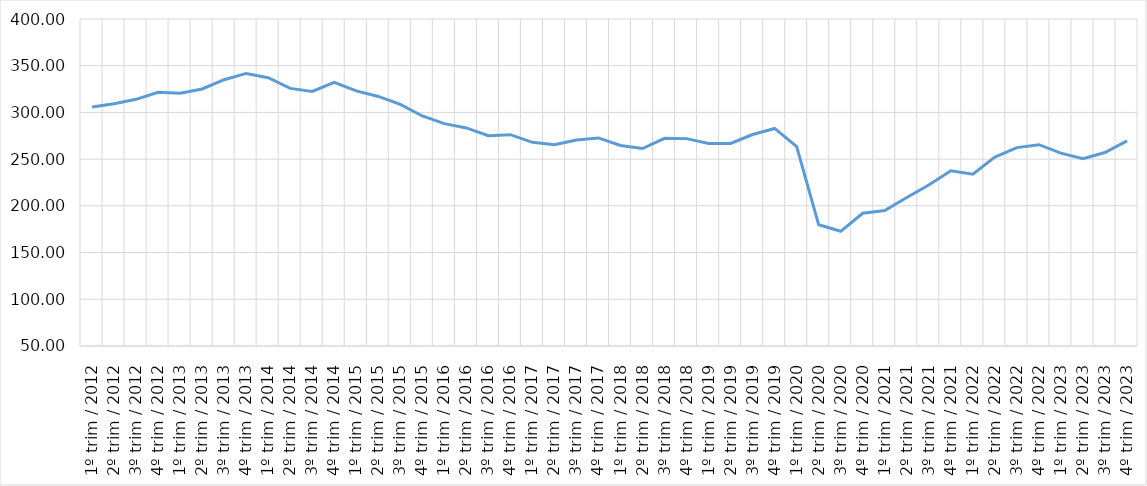
| Category | 40% mais pobres |
|---|---|
| 1º trim / 2012 | 305.834 |
| 2º trim / 2012 | 309.27 |
| 3º trim / 2012 | 314.035 |
| 4º trim / 2012 | 321.61 |
| 1º trim / 2013 | 320.483 |
| 2º trim / 2013 | 325.075 |
| 3º trim / 2013 | 334.989 |
| 4º trim / 2013 | 341.747 |
| 1º trim / 2014 | 337.115 |
| 2º trim / 2014 | 325.75 |
| 3º trim / 2014 | 322.489 |
| 4º trim / 2014 | 332.254 |
| 1º trim / 2015 | 323.009 |
| 2º trim / 2015 | 317.098 |
| 3º trim / 2015 | 308.635 |
| 4º trim / 2015 | 296.185 |
| 1º trim / 2016 | 288.044 |
| 2º trim / 2016 | 283.432 |
| 3º trim / 2016 | 275.116 |
| 4º trim / 2016 | 276.181 |
| 1º trim / 2017 | 268.001 |
| 2º trim / 2017 | 265.444 |
| 3º trim / 2017 | 270.522 |
| 4º trim / 2017 | 272.713 |
| 1º trim / 2018 | 264.583 |
| 2º trim / 2018 | 261.371 |
| 3º trim / 2018 | 272.252 |
| 4º trim / 2018 | 271.962 |
| 1º trim / 2019 | 266.667 |
| 2º trim / 2019 | 266.828 |
| 3º trim / 2019 | 276.358 |
| 4º trim / 2019 | 282.85 |
| 1º trim / 2020 | 263.529 |
| 2º trim / 2020 | 179.72 |
| 3º trim / 2020 | 172.766 |
| 4º trim / 2020 | 192.065 |
| 1º trim / 2021 | 194.922 |
| 2º trim / 2021 | 208.864 |
| 3º trim / 2021 | 222.355 |
| 4º trim / 2021 | 237.538 |
| 1º trim / 2022 | 233.929 |
| 2º trim / 2022 | 252.271 |
| 3º trim / 2022 | 262.336 |
| 4º trim / 2022 | 265.437 |
| 1º trim / 2023 | 256.464 |
| 2º trim / 2023 | 250.506 |
| 3º trim / 2023 | 257.085 |
| 4º trim / 2023 | 269.535 |